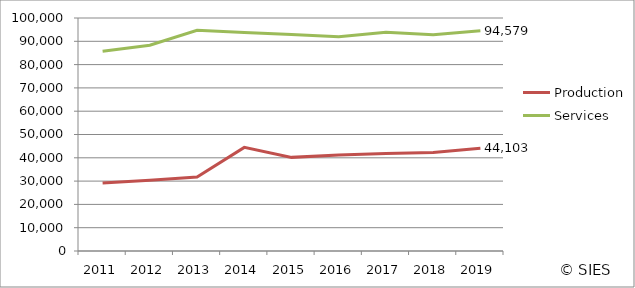
| Category | Production | Services |
|---|---|---|
| 2011.0 | 29185 | 85729 |
| 2012.0 | 30347 | 88282 |
| 2013.0 | 31770 | 94703 |
| 2014.0 | 44472 | 93800 |
| 2015.0 | 40184 | 92959 |
| 2016.0 | 41208 | 91936 |
| 2017.0 | 41895 | 93849 |
| 2018.0 | 42268 | 92822 |
| 2019.0 | 44103 | 94579 |